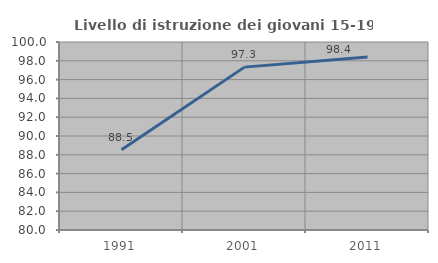
| Category | Livello di istruzione dei giovani 15-19 anni |
|---|---|
| 1991.0 | 88.545 |
| 2001.0 | 97.327 |
| 2011.0 | 98.414 |